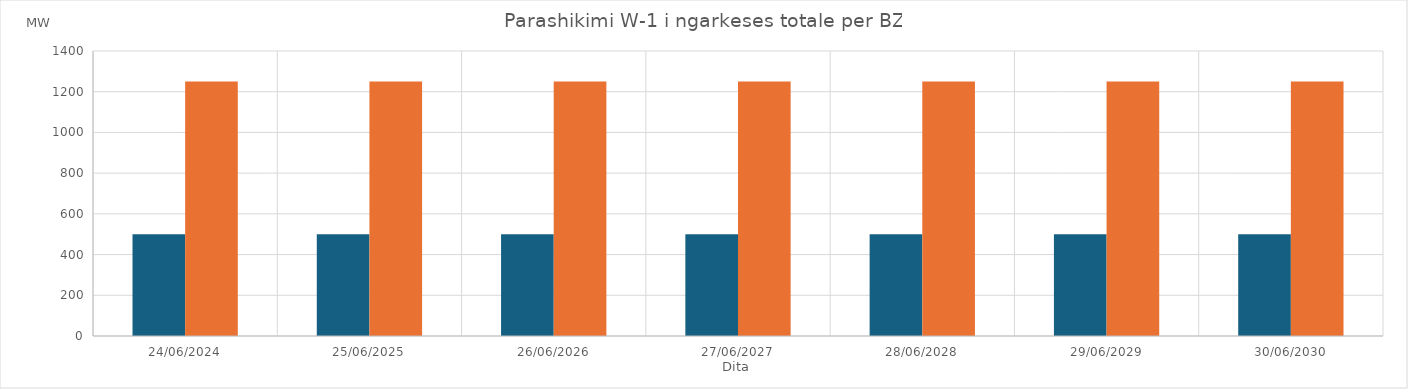
| Category | Min (MW) | Max (MW) |
|---|---|---|
| 24/06/2024 | 500 | 1250 |
| 25/06/2025 | 500 | 1250 |
| 26/06/2026 | 500 | 1250 |
| 27/06/2027 | 500 | 1250 |
| 28/06/2028 | 500 | 1250 |
| 29/06/2029 | 500 | 1250 |
| 30/06/2030 | 500 | 1250 |